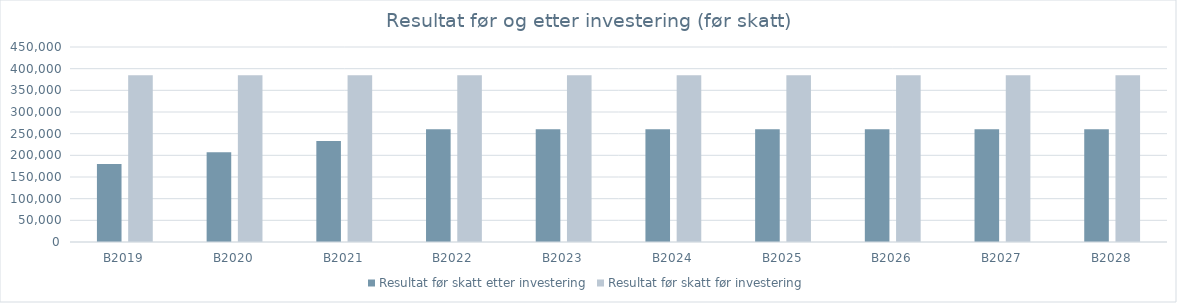
| Category | Resultat før skatt etter investering | Resultat før skatt før investering |
|---|---|---|
| B2019 | 180000 | 385000 |
| B2020 | 207000 | 385000 |
| B2021 | 233000 | 385000 |
| B2022 | 260000 | 385000 |
| B2023 | 260000 | 385000 |
| B2024 | 260000 | 385000 |
| B2025 | 260000 | 385000 |
| B2026 | 260000 | 385000 |
| B2027 | 260000 | 385000 |
| B2028 | 260000 | 385000 |